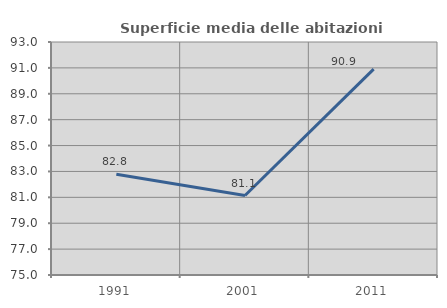
| Category | Superficie media delle abitazioni occupate |
|---|---|
| 1991.0 | 82.788 |
| 2001.0 | 81.141 |
| 2011.0 | 90.905 |